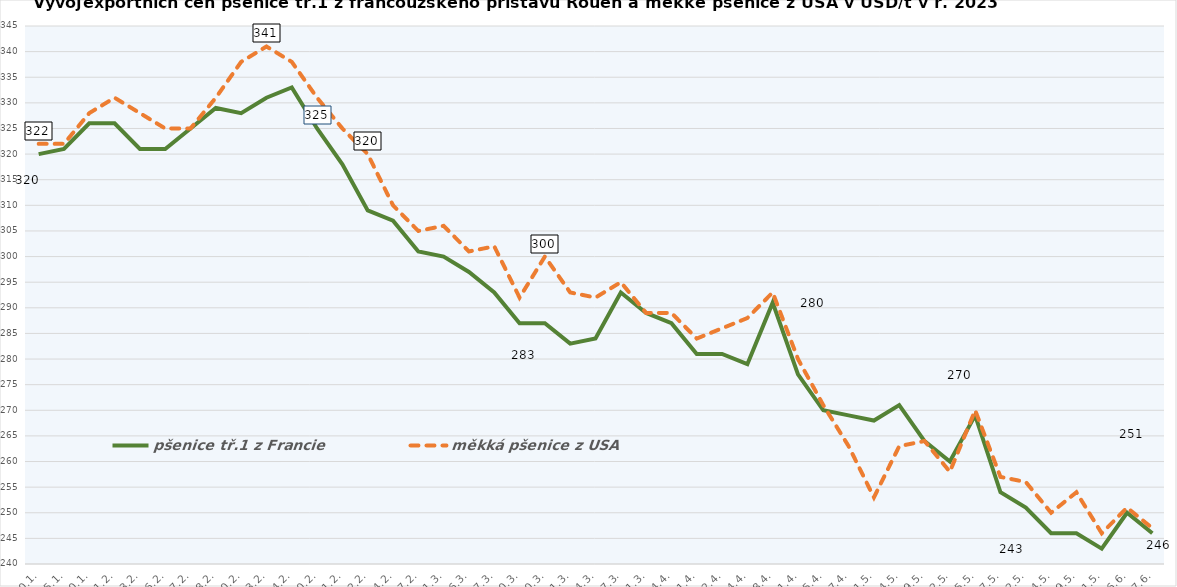
| Category | pšenice tř.1 z Francie | měkká pšenice z USA |
|---|---|---|
| 20.1. | 320 | 322 |
| 25.1. | 321 | 322 |
| 30.1. | 326 | 328 |
| 1.2. | 326 | 331 |
| 3.2. | 321 | 328 |
| 6.2. | 321 | 325 |
| 7.2. | 325 | 325 |
| 8.2. | 329 | 331 |
| 10.2. | 328 | 338 |
| 13.2. | 331 | 341 |
| 14.2. | 333 | 338 |
| 20.2. | 325 | 331 |
| 21.2. | 318 | 325 |
| 22.2. | 309 | 320 |
| 24.2. | 307 | 310 |
| 27.2. | 301 | 305 |
| 1.3. | 300 | 306 |
| 6.3. | 297 | 301 |
| 7.3. | 293 | 302 |
| 10.3. | 287 | 292 |
| 20.3. | 287 | 300 |
| 21.3. | 283 | 293 |
| 24.3. | 284 | 292 |
| 27.3. | 293 | 295 |
| 31.3. | 289 | 289 |
| 4.4. | 287 | 289 |
| 11.4. | 281 | 284 |
| 12.4. | 281 | 286 |
| 14.4. | 279 | 288 |
| 18.4. | 291 | 293 |
| 21.4. | 277 | 280 |
| 25.4. | 270 | 271 |
| 27.4. | 269 | 263 |
| 1.5. | 268 | 253 |
| 4.5. | 271 | 263 |
| 9.5. | 264 | 264 |
| 12.5. | 260 | 258 |
| 15.5. | 269 | 270 |
| 17.5. | 254 | 257 |
| 22.5. | 251 | 256 |
| 24.5. | 246 | 250 |
| 29.5. | 246 | 254 |
| 31.5. | 243 | 246 |
| 6.6. | 250 | 251 |
| 7.6. | 246 | 247 |